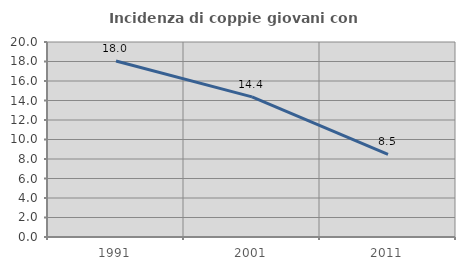
| Category | Incidenza di coppie giovani con figli |
|---|---|
| 1991.0 | 18.044 |
| 2001.0 | 14.376 |
| 2011.0 | 8.473 |